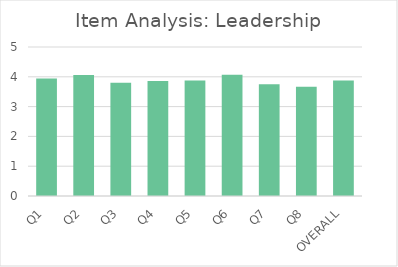
| Category | Series 0 |
|---|---|
| Q1 | 3.94 |
| Q2 | 4.06 |
| Q3 | 3.8 |
| Q4 | 3.86 |
| Q5 | 3.88 |
| Q6 | 4.07 |
| Q7 | 3.75 |
| Q8 | 3.67 |
| OVERALL | 3.88 |